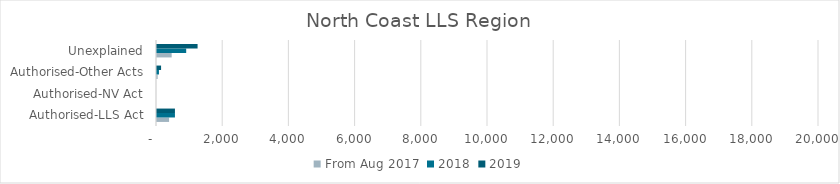
| Category | From Aug 2017 | 2018 | 2019 |
|---|---|---|---|
| Authorised-LLS Act | 365 | 542 | 542 |
| Authorised-NV Act | 0 | 0 | 0 |
| Authorised-Other Acts | 20 | 59 | 123 |
| Unexplained | 443 | 882 | 1226 |